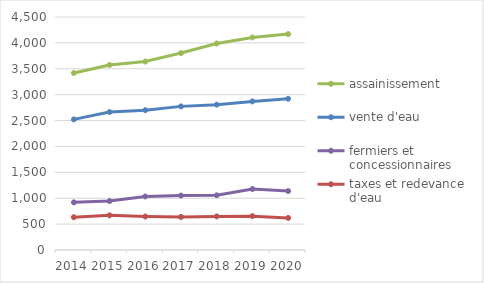
| Category | assainissement | vente d'eau | fermiers et concessionnaires | taxes et redevance d'eau |
|---|---|---|---|---|
| 2014.0 | 3418.134 | 2522.382 | 919.937 | 633.298 |
| 2015.0 | 3574.509 | 2663.986 | 945.162 | 669.329 |
| 2016.0 | 3640.117 | 2701.292 | 1034.235 | 646.774 |
| 2017.0 | 3804.069 | 2773.868 | 1050.665 | 638.289 |
| 2018.0 | 3988.379 | 2807.582 | 1056.345 | 648.666 |
| 2019.0 | 4105.312 | 2870.113 | 1177.276 | 654.009 |
| 2020.0 | 4169.867 | 2921.003 | 1138.454 | 619.356 |